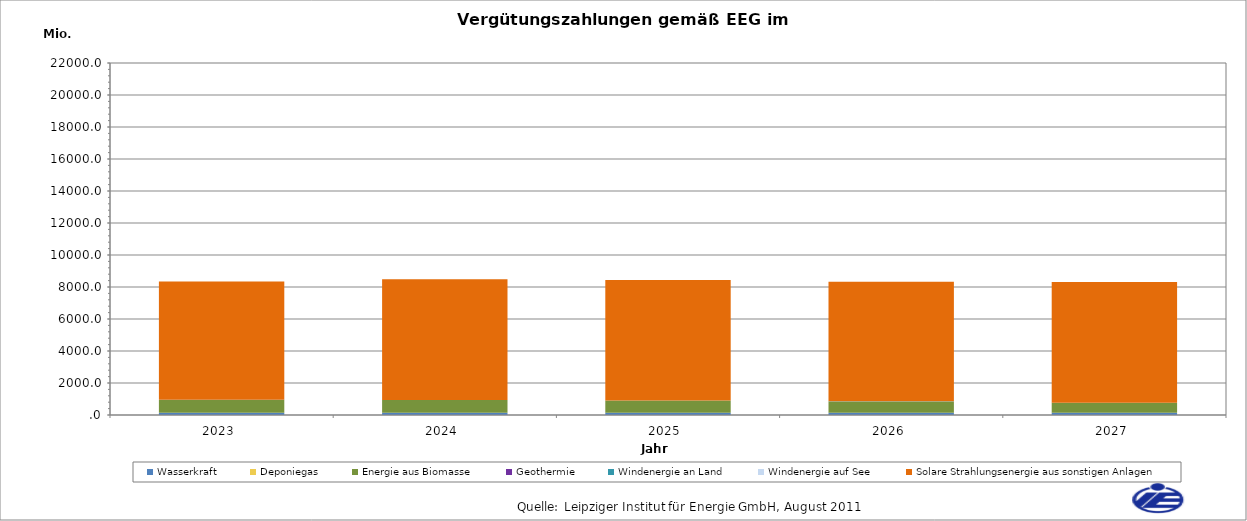
| Category | Wasserkraft | Deponiegas | Energie aus Biomasse | Geothermie | Windenergie an Land | Windenergie auf See | Solare Strahlungsenergie aus sonstigen Anlagen |
|---|---|---|---|---|---|---|---|
| 2023.0 | 143.79 | 2.707 | 795.201 | 1.656 | 7.268 | 0 | 7400.221 |
| 2024.0 | 143.863 | 1.913 | 786.19 | 1.662 | 4.952 | 0 | 7545.892 |
| 2025.0 | 143.197 | 1.658 | 763.28 | 1.656 | 3.775 | 0 | 7518.881 |
| 2026.0 | 142.996 | 1.408 | 704.725 | 1.656 | 3.475 | 0 | 7470.39 |
| 2027.0 | 142.433 | 1.237 | 616.961 | 1.656 | 1.088 | 0 | 7543.691 |